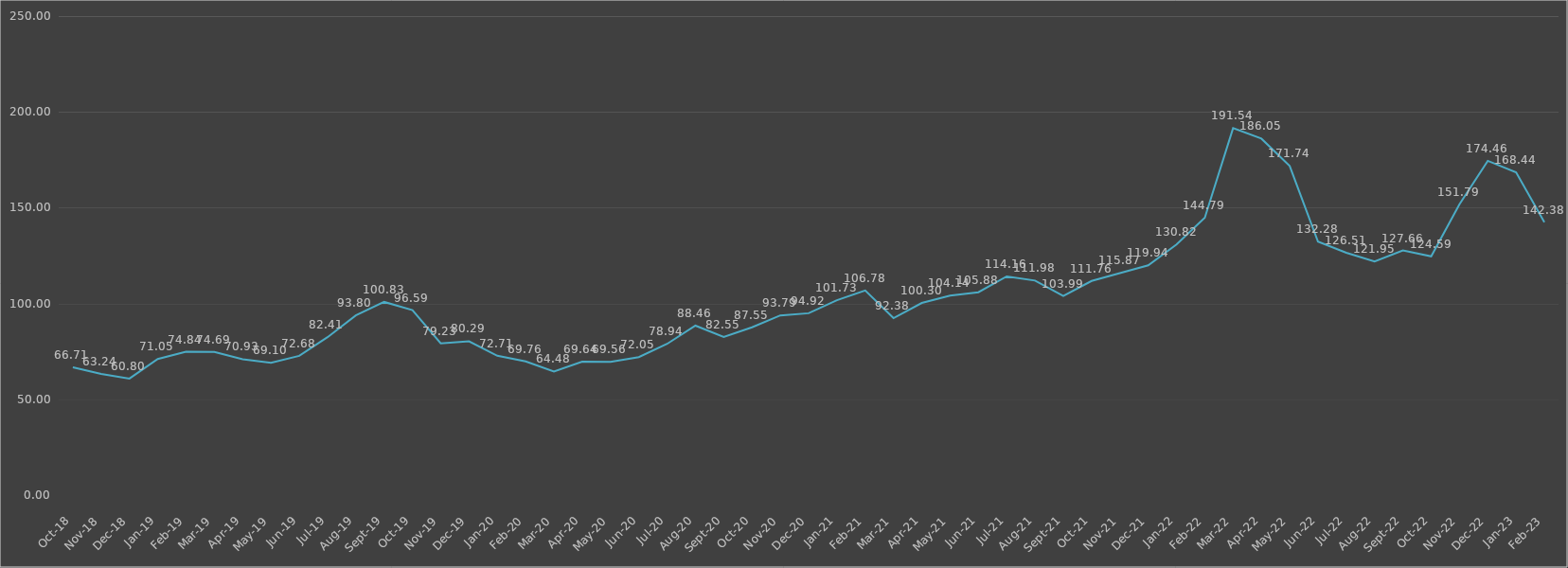
| Category | Series 0 |
|---|---|
| 2018-10-31 | 66.714 |
| 2018-11-30 | 63.242 |
| 2018-12-31 | 60.803 |
| 2019-01-31 | 71.047 |
| 2019-02-28 | 74.835 |
| 2019-03-31 | 74.692 |
| 2019-04-30 | 70.933 |
| 2019-05-31 | 69.096 |
| 2019-06-30 | 72.683 |
| 2019-07-31 | 82.41 |
| 2019-08-31 | 93.802 |
| 2019-09-30 | 100.832 |
| 2019-10-31 | 96.585 |
| 2019-11-30 | 79.225 |
| 2019-12-31 | 80.287 |
| 2020-01-31 | 72.712 |
| 2020-02-29 | 69.756 |
| 2020-03-31 | 64.476 |
| 2020-04-30 | 69.636 |
| 2020-05-31 | 69.555 |
| 2020-06-30 | 72.052 |
| 2020-07-31 | 78.944 |
| 2020-08-31 | 88.459 |
| 2020-09-30 | 82.554 |
| 2020-10-31 | 87.552 |
| 2020-11-30 | 93.791 |
| 2020-12-31 | 94.921 |
| 2021-01-31 | 101.733 |
| 2021-02-28 | 106.783 |
| 2021-03-31 | 92.385 |
| 2021-04-30 | 100.298 |
| 2021-05-31 | 104.143 |
| 2021-06-30 | 105.882 |
| 2021-07-31 | 114.158 |
| 2021-08-31 | 111.983 |
| 2021-09-30 | 103.989 |
| 2021-10-31 | 111.765 |
| 2021-11-30 | 115.868 |
| 2021-12-31 | 119.943 |
| 2022-01-31 | 130.818 |
| 2022-02-28 | 144.792 |
| 2022-03-31 | 191.535 |
| 2022-04-30 | 186.055 |
| 2022-05-31 | 171.736 |
| 2022-06-30 | 132.281 |
| 2022-07-31 | 126.514 |
| 2022-08-31 | 121.951 |
| 2022-09-30 | 127.661 |
| 2022-10-31 | 124.591 |
| 2022-11-30 | 151.793 |
| 2022-12-31 | 174.462 |
| 2023-01-31 | 168.436 |
| 2023-02-28 | 142.382 |